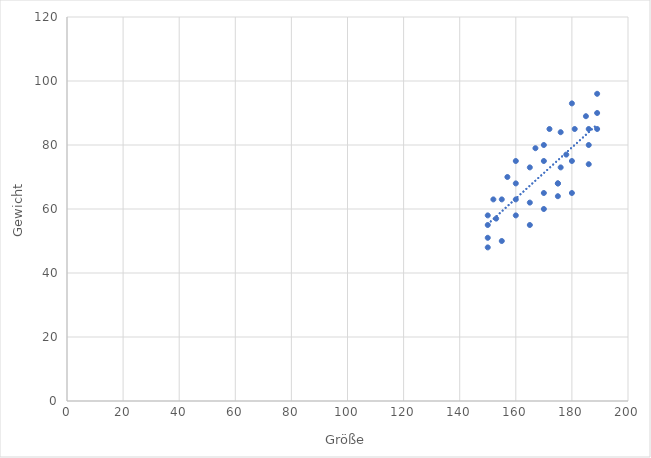
| Category | Series 0 |
|---|---|
| 150.0 | 48 |
| 150.0 | 51 |
| 150.0 | 55 |
| 150.0 | 58 |
| 152.0 | 63 |
| 153.0 | 57 |
| 155.0 | 50 |
| 155.0 | 63 |
| 157.0 | 70 |
| 160.0 | 58 |
| 160.0 | 63 |
| 160.0 | 68 |
| 160.0 | 75 |
| 165.0 | 55 |
| 165.0 | 62 |
| 165.0 | 73 |
| 167.0 | 79 |
| 170.0 | 65 |
| 170.0 | 60 |
| 170.0 | 75 |
| 170.0 | 80 |
| 172.0 | 85 |
| 175.0 | 68 |
| 175.0 | 64 |
| 175.0 | 68 |
| 176.0 | 84 |
| 176.0 | 73 |
| 178.0 | 77 |
| 180.0 | 93 |
| 180.0 | 65 |
| 180.0 | 75 |
| 181.0 | 85 |
| 185.0 | 89 |
| 186.0 | 80 |
| 186.0 | 74 |
| 186.0 | 85 |
| 189.0 | 90 |
| 189.0 | 85 |
| 189.0 | 96 |